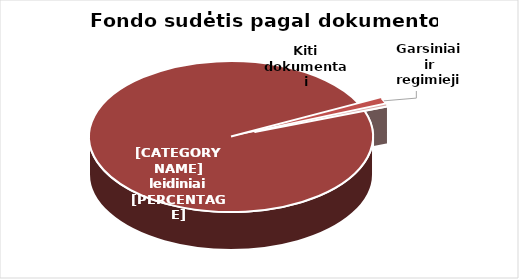
| Category | Series 0 |
|---|---|
| Knygos ir serialiniai | 1053151 |
| Garsiniai ir regimieji | 13521 |
| Kiti dokumentai | 4850 |